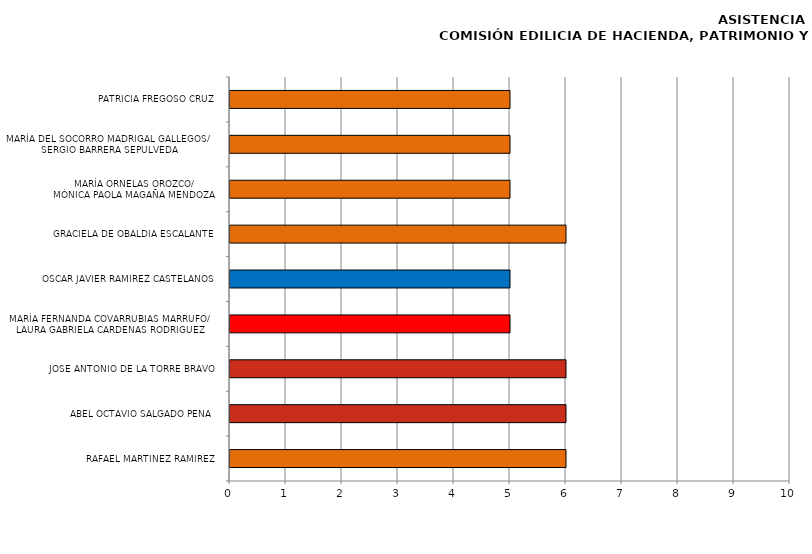
| Category | Series 0 |
|---|---|
| RAFAEL MARTÍNEZ RAMÍREZ | 6 |
| ABEL OCTAVIO SALGADO PEÑA  | 6 |
| JOSÉ ANTONIO DE LA TORRE BRAVO | 6 |
| MARÍA FERNANDA COVARRUBIAS MARRUFO/
LAURA GABRIELA CARDENAS RODRIGUEZ | 5 |
| OSCAR JAVIER RAMÍREZ CASTELANOS | 5 |
| GRACIELA DE OBALDÍA ESCALANTE | 6 |
| MARÍA ORNELAS OROZCO/
MÓNICA PAOLA MAGAÑA MENDOZA | 5 |
| MARÍA DEL SOCORRO MADRIGAL GALLEGOS/
SERGIO BARRERA SEPULVEDA | 5 |
| PATRICIA FREGOSO CRUZ | 5 |